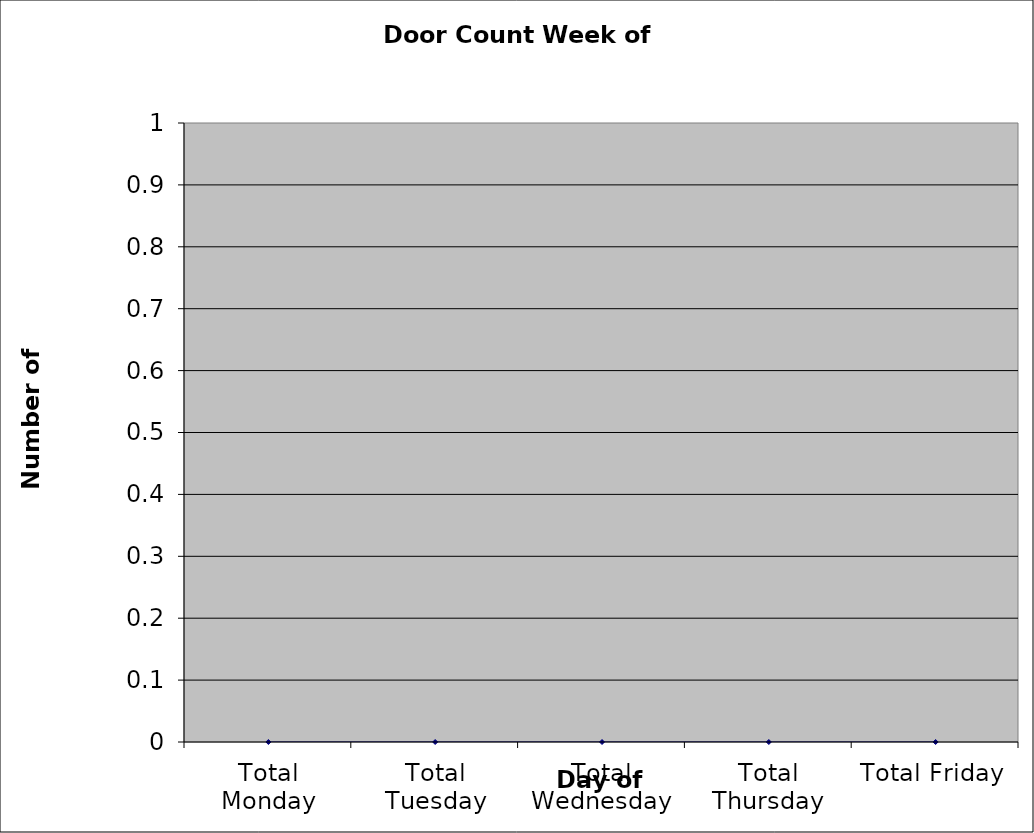
| Category | Series 0 |
|---|---|
| Total Monday | 0 |
| Total Tuesday | 0 |
| Total Wednesday | 0 |
| Total Thursday | 0 |
| Total Friday | 0 |